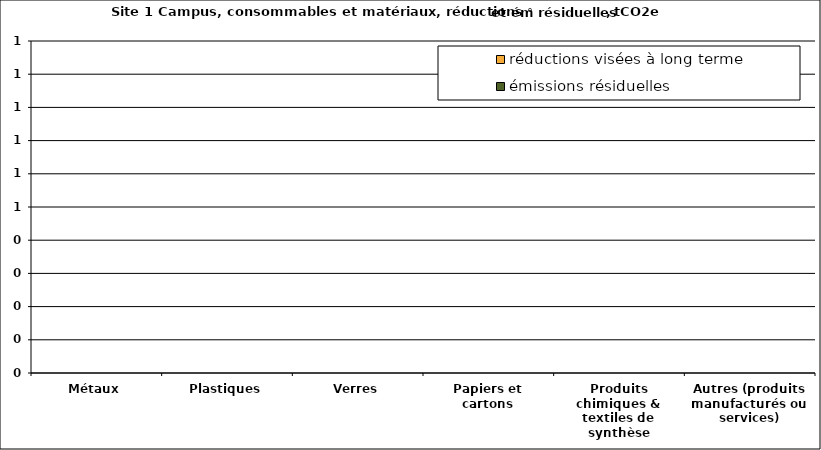
| Category | émissions résiduelles | réductions visées à long terme |
|---|---|---|
| Métaux | 0 | 0 |
| Plastiques | 0 | 0 |
| Verres | 0 | 0 |
| Papiers et cartons | 0 | 0 |
| Produits chimiques & textiles de synthèse | 0 | 0 |
| Autres (produits manufacturés ou services) | 0 | 0 |